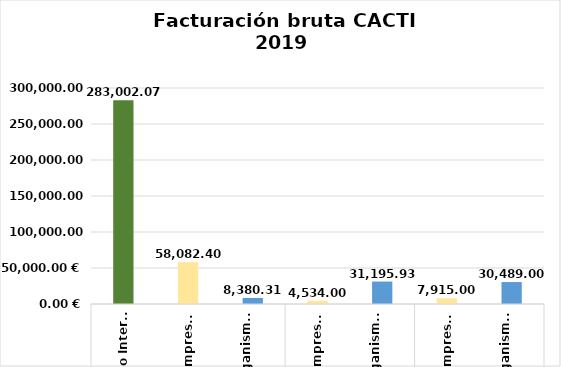
| Category | Series 0 |
|---|---|
| 0 | 283002.072 |
| 1 | 58082.405 |
| 2 | 8380.306 |
| 3 | 4534 |
| 4 | 31195.926 |
| 5 | 7915 |
| 6 | 30489 |